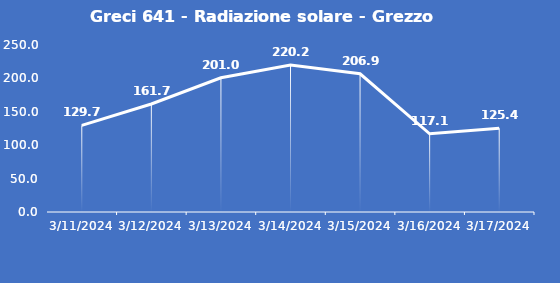
| Category | Greci 641 - Radiazione solare - Grezzo (W/m2) |
|---|---|
| 3/11/24 | 129.7 |
| 3/12/24 | 161.7 |
| 3/13/24 | 201 |
| 3/14/24 | 220.2 |
| 3/15/24 | 206.9 |
| 3/16/24 | 117.1 |
| 3/17/24 | 125.4 |